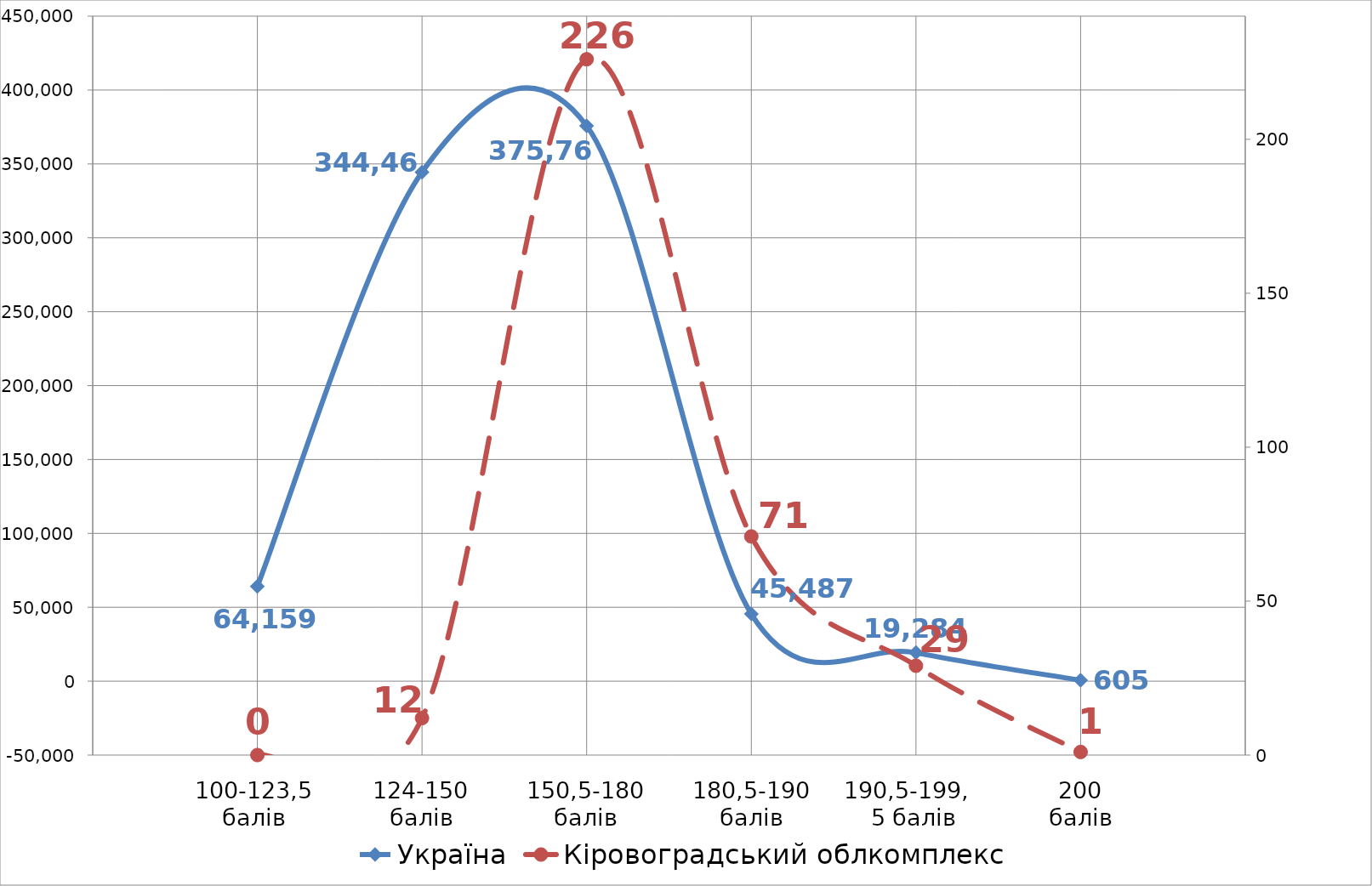
| Category | Україна |
|---|---|
| 0 | 64159 |
| 1 | 344466 |
| 2 | 375767 |
| 3 | 45487 |
| 4 | 19284 |
| 5 | 605 |